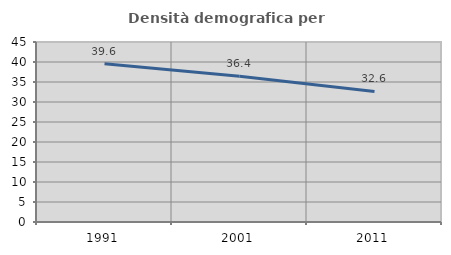
| Category | Densità demografica |
|---|---|
| 1991.0 | 39.585 |
| 2001.0 | 36.414 |
| 2011.0 | 32.629 |